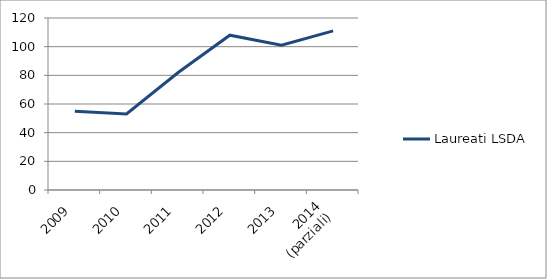
| Category | Laureati LSDA |
|---|---|
| 2009 | 55 |
| 2010 | 53 |
| 2011 | 82 |
| 2012 | 108 |
| 2013 | 101 |
| 2014
(parziali) | 111 |